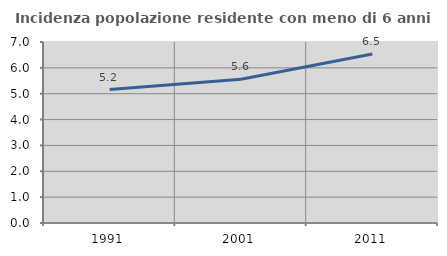
| Category | Incidenza popolazione residente con meno di 6 anni |
|---|---|
| 1991.0 | 5.158 |
| 2001.0 | 5.561 |
| 2011.0 | 6.537 |